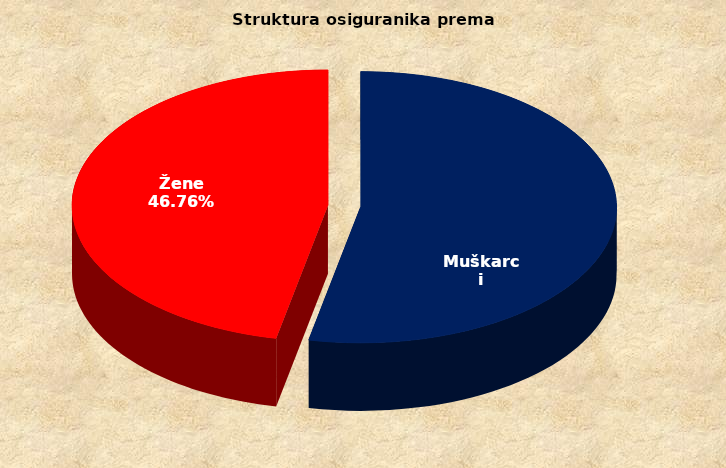
| Category | Series 0 |
|---|---|
| Muškarci | 880560 |
| Žene | 773320 |